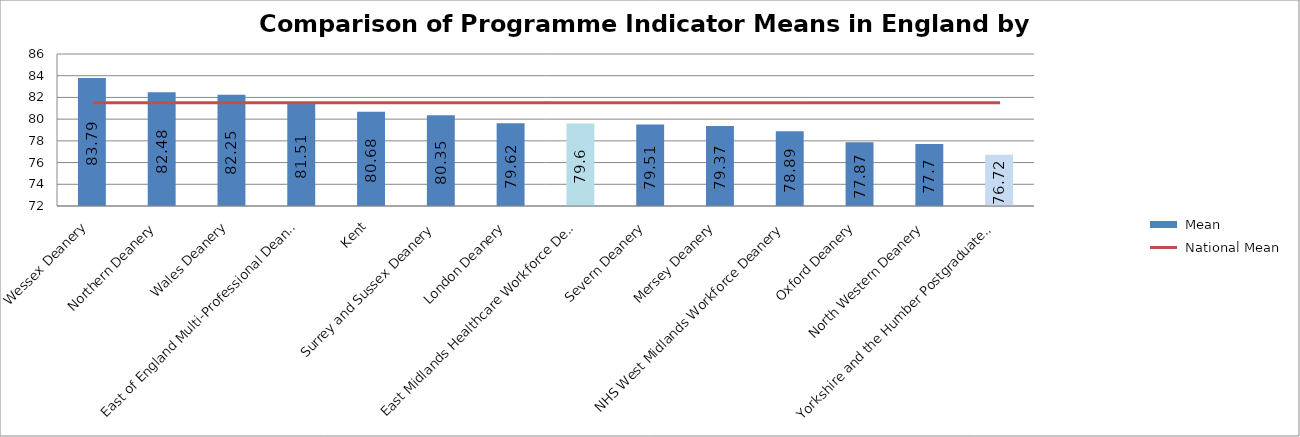
| Category |  Mean |
|---|---|
| Wessex Deanery | 83.79 |
| Northern Deanery | 82.48 |
| Wales Deanery | 82.25 |
| East of England Multi-Professional Deanery | 81.51 |
| Kent, Surrey and Sussex Deanery | 80.68 |
| London Deanery | 80.35 |
| East Midlands Healthcare Workforce Deanery | 79.62 |
| Severn Deanery | 79.6 |
| Mersey Deanery | 79.51 |
| NHS West Midlands Workforce Deanery | 79.37 |
| Oxford Deanery | 78.89 |
| North Western Deanery | 77.87 |
| Yorkshire and the Humber Postgraduate Deanery | 77.7 |
| South West Peninsula Deanery | 76.72 |